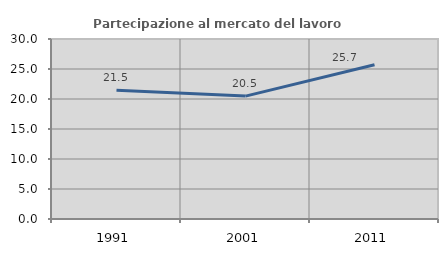
| Category | Partecipazione al mercato del lavoro  femminile |
|---|---|
| 1991.0 | 21.472 |
| 2001.0 | 20.483 |
| 2011.0 | 25.696 |